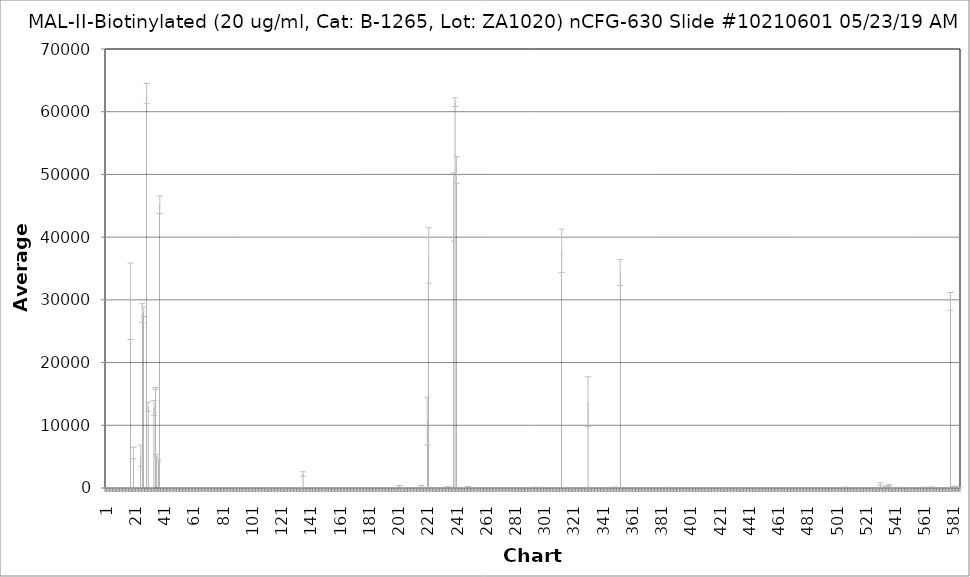
| Category | Average RFU |
|---|---|
| 1.0 | 18.25 |
| 2.0 | 6.75 |
| 3.0 | 15.5 |
| 4.0 | 2.25 |
| 5.0 | 37.75 |
| 6.0 | 1.25 |
| 7.0 | 7.5 |
| 8.0 | 15.75 |
| 9.0 | 2.25 |
| 10.0 | -4 |
| 11.0 | 5.25 |
| 12.0 | 25.75 |
| 13.0 | 25 |
| 14.0 | 26.5 |
| 15.0 | 14.5 |
| 16.0 | 16.5 |
| 17.0 | 6 |
| 18.0 | 29775.25 |
| 19.0 | 26.5 |
| 20.0 | 5591 |
| 21.0 | 12 |
| 22.0 | 43 |
| 23.0 | 11.5 |
| 24.0 | 32.75 |
| 25.0 | 5152.25 |
| 26.0 | 27880.75 |
| 27.0 | 28108.75 |
| 28.0 | 12.75 |
| 29.0 | 62891.5 |
| 30.0 | 12974.25 |
| 31.0 | 50 |
| 32.0 | 26.5 |
| 33.0 | 5 |
| 34.0 | 12738.5 |
| 35.0 | 15885.5 |
| 36.0 | 5072.5 |
| 37.0 | 4325 |
| 38.0 | 45175.25 |
| 39.0 | 9.5 |
| 40.0 | 11.25 |
| 41.0 | 28.75 |
| 42.0 | 17.5 |
| 43.0 | 16.75 |
| 44.0 | 20.75 |
| 45.0 | 33.75 |
| 46.0 | 27.25 |
| 47.0 | -0.75 |
| 48.0 | -1 |
| 49.0 | 14.25 |
| 50.0 | 31.75 |
| 51.0 | 26 |
| 52.0 | 15.5 |
| 53.0 | 2.75 |
| 54.0 | 29.75 |
| 55.0 | 22 |
| 56.0 | 22.25 |
| 57.0 | 34.25 |
| 58.0 | 11.5 |
| 59.0 | 22 |
| 60.0 | 15 |
| 61.0 | 12.75 |
| 62.0 | 22.5 |
| 63.0 | 19.25 |
| 64.0 | 18 |
| 65.0 | 24 |
| 66.0 | 19.75 |
| 67.0 | 17.5 |
| 68.0 | 24.5 |
| 69.0 | 25.5 |
| 70.0 | 29.25 |
| 71.0 | 22.25 |
| 72.0 | 30 |
| 73.0 | 8.25 |
| 74.0 | 20.5 |
| 75.0 | 18.25 |
| 76.0 | 14.25 |
| 77.0 | 23.5 |
| 78.0 | 6 |
| 79.0 | 14.5 |
| 80.0 | -6.5 |
| 81.0 | 22 |
| 82.0 | 27 |
| 83.0 | 42 |
| 84.0 | 4.5 |
| 85.0 | 13.25 |
| 86.0 | 20.75 |
| 87.0 | 43.25 |
| 88.0 | 4.5 |
| 89.0 | 12.25 |
| 90.0 | 18.75 |
| 91.0 | 15.75 |
| 92.0 | 26.25 |
| 93.0 | 47.5 |
| 94.0 | 18 |
| 95.0 | 21.75 |
| 96.0 | 22.75 |
| 97.0 | 24.5 |
| 98.0 | 16.25 |
| 99.0 | 21.75 |
| 100.0 | 2 |
| 101.0 | 3.5 |
| 102.0 | 29 |
| 103.0 | 12.75 |
| 104.0 | 13 |
| 105.0 | 26 |
| 106.0 | 17 |
| 107.0 | 18 |
| 108.0 | 22.5 |
| 109.0 | 37 |
| 110.0 | 22.25 |
| 111.0 | -18.5 |
| 112.0 | 9.5 |
| 113.0 | 22 |
| 114.0 | 12 |
| 115.0 | 14.75 |
| 116.0 | 12.75 |
| 117.0 | 29 |
| 118.0 | 13 |
| 119.0 | 9.5 |
| 120.0 | 14.25 |
| 121.0 | 24 |
| 122.0 | 20.25 |
| 123.0 | 23.25 |
| 124.0 | 13.75 |
| 125.0 | 2.25 |
| 126.0 | 14.75 |
| 127.0 | 19.75 |
| 128.0 | 21.5 |
| 129.0 | 9.75 |
| 130.0 | 16.75 |
| 131.0 | 30.75 |
| 132.0 | 38 |
| 133.0 | 24.5 |
| 134.0 | -14.75 |
| 135.0 | 14.25 |
| 136.0 | 2227 |
| 137.0 | 16.25 |
| 138.0 | 9.25 |
| 139.0 | 3.75 |
| 140.0 | 19.25 |
| 141.0 | 17.5 |
| 142.0 | -6.75 |
| 143.0 | 24.5 |
| 144.0 | 27.25 |
| 145.0 | 17 |
| 146.0 | 3 |
| 147.0 | 3.5 |
| 148.0 | 11.75 |
| 149.0 | 13.25 |
| 150.0 | 9.25 |
| 151.0 | 22.75 |
| 152.0 | 15 |
| 153.0 | 18.75 |
| 154.0 | 25 |
| 155.0 | 15.25 |
| 156.0 | 15.25 |
| 157.0 | 27.5 |
| 158.0 | 20.5 |
| 159.0 | 19 |
| 160.0 | 32.25 |
| 161.0 | 17 |
| 162.0 | 7.5 |
| 163.0 | 30.5 |
| 164.0 | 12.75 |
| 165.0 | 6.5 |
| 166.0 | 21.5 |
| 167.0 | 28.25 |
| 168.0 | 23.75 |
| 169.0 | -3 |
| 170.0 | -1.25 |
| 171.0 | 20 |
| 172.0 | 22.75 |
| 173.0 | 17.25 |
| 174.0 | 28 |
| 175.0 | 14.25 |
| 176.0 | 23.25 |
| 177.0 | 24.25 |
| 178.0 | 13.75 |
| 179.0 | 22.75 |
| 180.0 | 13.5 |
| 181.0 | 12.5 |
| 182.0 | 21.25 |
| 183.0 | 22 |
| 184.0 | 3.25 |
| 185.0 | 10 |
| 186.0 | 10.5 |
| 187.0 | 21.25 |
| 188.0 | -57 |
| 189.0 | 13.25 |
| 190.0 | 13 |
| 191.0 | 21.25 |
| 192.0 | 15.25 |
| 193.0 | 23 |
| 194.0 | 3.25 |
| 195.0 | 1.75 |
| 196.0 | 5.75 |
| 197.0 | 21.75 |
| 198.0 | 11.75 |
| 199.0 | 17.5 |
| 200.0 | 21.5 |
| 201.0 | -24.25 |
| 202.0 | 375.5 |
| 203.0 | 6.75 |
| 204.0 | 28.75 |
| 205.0 | -3.5 |
| 206.0 | 21.75 |
| 207.0 | 16.75 |
| 208.0 | 16.75 |
| 209.0 | 24 |
| 210.0 | 30 |
| 211.0 | 14.75 |
| 212.0 | 19.25 |
| 213.0 | 74.75 |
| 214.0 | 18 |
| 215.0 | -11.25 |
| 216.0 | 33 |
| 217.0 | 377.5 |
| 218.0 | 21.5 |
| 219.0 | 9.5 |
| 220.0 | 21 |
| 221.0 | 10670.75 |
| 222.0 | 37067 |
| 223.0 | 7.5 |
| 224.0 | 30 |
| 225.0 | 18.25 |
| 226.0 | 20.25 |
| 227.0 | 23 |
| 228.0 | 53.5 |
| 229.0 | 25.25 |
| 230.0 | 25.75 |
| 231.0 | 15.25 |
| 232.0 | 7.75 |
| 233.0 | 1.75 |
| 234.0 | 16.75 |
| 235.0 | 172 |
| 236.0 | 18.5 |
| 237.0 | 7.5 |
| 238.0 | 13.75 |
| 239.0 | 44797.75 |
| 240.0 | 61518.75 |
| 241.0 | 50706.5 |
| 242.0 | 12 |
| 243.0 | 26.75 |
| 244.0 | 19.5 |
| 245.0 | 21 |
| 246.0 | 23.25 |
| 247.0 | 12 |
| 248.0 | 25 |
| 249.0 | -107 |
| 250.0 | 13.5 |
| 251.0 | 7 |
| 252.0 | 13.25 |
| 253.0 | 27.25 |
| 254.0 | 16 |
| 255.0 | 22 |
| 256.0 | 9.5 |
| 257.0 | 6.75 |
| 258.0 | 16.5 |
| 259.0 | 24.25 |
| 260.0 | 21 |
| 261.0 | 16.75 |
| 262.0 | -2 |
| 263.0 | 3.25 |
| 264.0 | 21.5 |
| 265.0 | 18.5 |
| 266.0 | 19.25 |
| 267.0 | 9.75 |
| 268.0 | 5.5 |
| 269.0 | 21.75 |
| 270.0 | 18 |
| 271.0 | 21.5 |
| 272.0 | -17.5 |
| 273.0 | 13.75 |
| 274.0 | 6.25 |
| 275.0 | 15.5 |
| 276.0 | 15.25 |
| 277.0 | 10.75 |
| 278.0 | 28.5 |
| 279.0 | 22.5 |
| 280.0 | 9.25 |
| 281.0 | 15.5 |
| 282.0 | 10.75 |
| 283.0 | 25.75 |
| 284.0 | -13 |
| 285.0 | 20.75 |
| 286.0 | 15.25 |
| 287.0 | 22 |
| 288.0 | 26.5 |
| 289.0 | 33 |
| 290.0 | 22 |
| 291.0 | 19 |
| 292.0 | 23.75 |
| 293.0 | 26 |
| 294.0 | 33.25 |
| 295.0 | 101.25 |
| 296.0 | 29.75 |
| 297.0 | 20.5 |
| 298.0 | 21.5 |
| 299.0 | 19.5 |
| 300.0 | 23 |
| 301.0 | 14.5 |
| 302.0 | 24.75 |
| 303.0 | 10 |
| 304.0 | 25.25 |
| 305.0 | 22.25 |
| 306.0 | 16.75 |
| 307.0 | -12.25 |
| 308.0 | 23.25 |
| 309.0 | 16 |
| 310.0 | 23 |
| 311.0 | 20.5 |
| 312.0 | 18.75 |
| 313.0 | 37825.25 |
| 314.0 | 24.25 |
| 315.0 | 25.25 |
| 316.0 | 1 |
| 317.0 | 18.25 |
| 318.0 | 18.75 |
| 319.0 | 38 |
| 320.0 | 12 |
| 321.0 | 12.5 |
| 322.0 | 29 |
| 323.0 | 22.5 |
| 324.0 | 5.25 |
| 325.0 | 10.75 |
| 326.0 | 11.5 |
| 327.0 | 16.75 |
| 328.0 | 25.5 |
| 329.0 | 8 |
| 330.0 | 22.25 |
| 331.0 | 13753.5 |
| 332.0 | -7.75 |
| 333.0 | 46.25 |
| 334.0 | 21.5 |
| 335.0 | 23 |
| 336.0 | 52.75 |
| 337.0 | -7 |
| 338.0 | 22.75 |
| 339.0 | 15.75 |
| 340.0 | 22.25 |
| 341.0 | 10 |
| 342.0 | 5.5 |
| 343.0 | 29.25 |
| 344.0 | 31.25 |
| 345.0 | 23.5 |
| 346.0 | 38.5 |
| 347.0 | -4.25 |
| 348.0 | 31.75 |
| 349.0 | 109.5 |
| 350.0 | 23 |
| 351.0 | 8.5 |
| 352.0 | 19.25 |
| 353.0 | 34361 |
| 354.0 | 28.25 |
| 355.0 | 63.5 |
| 356.0 | 66 |
| 357.0 | 45.25 |
| 358.0 | 19.25 |
| 359.0 | 78 |
| 360.0 | -47 |
| 361.0 | 15.75 |
| 362.0 | 8.25 |
| 363.0 | 27 |
| 364.0 | 22.75 |
| 365.0 | 25.25 |
| 366.0 | 43 |
| 367.0 | 37 |
| 368.0 | 35.75 |
| 369.0 | 44.75 |
| 370.0 | 17.75 |
| 371.0 | 22 |
| 372.0 | 53.5 |
| 373.0 | 45.75 |
| 374.0 | 0 |
| 375.0 | 21.75 |
| 376.0 | 21.5 |
| 377.0 | 26.5 |
| 378.0 | 37.5 |
| 379.0 | 24.5 |
| 380.0 | 28 |
| 381.0 | 27.25 |
| 382.0 | 23 |
| 383.0 | 26.5 |
| 384.0 | 23.5 |
| 385.0 | 31.5 |
| 386.0 | 74 |
| 387.0 | 24.5 |
| 388.0 | 41 |
| 389.0 | 38.25 |
| 390.0 | 22 |
| 391.0 | 24.75 |
| 392.0 | 20.25 |
| 393.0 | 30.25 |
| 394.0 | 24.25 |
| 395.0 | 17.25 |
| 396.0 | 33.25 |
| 397.0 | 22.75 |
| 398.0 | 24 |
| 399.0 | 24 |
| 400.0 | 25 |
| 401.0 | 27.5 |
| 402.0 | 30 |
| 403.0 | 26.75 |
| 404.0 | 31.25 |
| 405.0 | 26.25 |
| 406.0 | 26.25 |
| 407.0 | 26.75 |
| 408.0 | 9.25 |
| 409.0 | 56.75 |
| 410.0 | 32.25 |
| 411.0 | 36.75 |
| 412.0 | 18.5 |
| 413.0 | 16 |
| 414.0 | -4.25 |
| 415.0 | 5.25 |
| 416.0 | 3.5 |
| 417.0 | 25.5 |
| 418.0 | 15.25 |
| 419.0 | 27.5 |
| 420.0 | 41.5 |
| 421.0 | 27.75 |
| 422.0 | 18.75 |
| 423.0 | 29 |
| 424.0 | 13.5 |
| 425.0 | 19 |
| 426.0 | 16.75 |
| 427.0 | 6.25 |
| 428.0 | 24.25 |
| 429.0 | 22.25 |
| 430.0 | 26.75 |
| 431.0 | 20.5 |
| 432.0 | 24.25 |
| 433.0 | 17 |
| 434.0 | 0.75 |
| 435.0 | -2 |
| 436.0 | 3.5 |
| 437.0 | -12.25 |
| 438.0 | -4.75 |
| 439.0 | 39.75 |
| 440.0 | 33.75 |
| 441.0 | 20.75 |
| 442.0 | 21.75 |
| 443.0 | 23.25 |
| 444.0 | 24.5 |
| 445.0 | 3 |
| 446.0 | 27 |
| 447.0 | 26.5 |
| 448.0 | 51.5 |
| 449.0 | 7.25 |
| 450.0 | 65.75 |
| 451.0 | 24.5 |
| 452.0 | -1.25 |
| 453.0 | -3 |
| 454.0 | 4.75 |
| 455.0 | -4 |
| 456.0 | 17 |
| 457.0 | 15.5 |
| 458.0 | 11.75 |
| 459.0 | 8.75 |
| 460.0 | 1.25 |
| 461.0 | 0.75 |
| 462.0 | 25.5 |
| 463.0 | -6 |
| 464.0 | 23.25 |
| 465.0 | 55.25 |
| 466.0 | 27.25 |
| 467.0 | 38.75 |
| 468.0 | 38.5 |
| 469.0 | 18 |
| 470.0 | 27.75 |
| 471.0 | 16.75 |
| 472.0 | 26.5 |
| 473.0 | 31.75 |
| 474.0 | 30.25 |
| 475.0 | -12 |
| 476.0 | 20.5 |
| 477.0 | 48.75 |
| 478.0 | 19.25 |
| 479.0 | 17 |
| 480.0 | 17.5 |
| 481.0 | 27.5 |
| 482.0 | 30 |
| 483.0 | -0.5 |
| 484.0 | 23.5 |
| 485.0 | 5.5 |
| 486.0 | 27 |
| 487.0 | 47.25 |
| 488.0 | 18.25 |
| 489.0 | 10.25 |
| 490.0 | -8 |
| 491.0 | 17.25 |
| 492.0 | 25.25 |
| 493.0 | 27.5 |
| 494.0 | 11.5 |
| 495.0 | 21.5 |
| 496.0 | 26.25 |
| 497.0 | 24 |
| 498.0 | -4.75 |
| 499.0 | 10 |
| 500.0 | 25.5 |
| 501.0 | 7.25 |
| 502.0 | 14.5 |
| 503.0 | -2 |
| 504.0 | 15.5 |
| 505.0 | -2.75 |
| 506.0 | 0.75 |
| 507.0 | 104.5 |
| 508.0 | 9.5 |
| 509.0 | 2 |
| 510.0 | -12.5 |
| 511.0 | 6.25 |
| 512.0 | 21.25 |
| 513.0 | 21.5 |
| 514.0 | 14.25 |
| 515.0 | 16.75 |
| 516.0 | 8.5 |
| 517.0 | 17.5 |
| 518.0 | 15.5 |
| 519.0 | -0.25 |
| 520.0 | 12.5 |
| 521.0 | 3.5 |
| 522.0 | 16.5 |
| 523.0 | 24.25 |
| 524.0 | 23.5 |
| 525.0 | 24.75 |
| 526.0 | 19.5 |
| 527.0 | 17 |
| 528.0 | 8.5 |
| 529.0 | 17.75 |
| 530.0 | 30 |
| 531.0 | 648 |
| 532.0 | 6.25 |
| 533.0 | 13.5 |
| 534.0 | 38.25 |
| 535.0 | 276.75 |
| 536.0 | 35 |
| 537.0 | 414.75 |
| 538.0 | 61.75 |
| 539.0 | 7.75 |
| 540.0 | 19 |
| 541.0 | 19.75 |
| 542.0 | 19 |
| 543.0 | 7.5 |
| 544.0 | 17 |
| 545.0 | 63 |
| 546.0 | 72.75 |
| 547.0 | 68.25 |
| 548.0 | 15 |
| 549.0 | 11.75 |
| 550.0 | 9.25 |
| 551.0 | 38.75 |
| 552.0 | 28.75 |
| 553.0 | 13.5 |
| 554.0 | 29.25 |
| 555.0 | 17.25 |
| 556.0 | 8.25 |
| 557.0 | 51.5 |
| 558.0 | 77.5 |
| 559.0 | 5.25 |
| 560.0 | 33.75 |
| 561.0 | 33.75 |
| 562.0 | 91.5 |
| 563.0 | 60.5 |
| 564.0 | 50.5 |
| 565.0 | 67.25 |
| 566.0 | 119 |
| 567.0 | -4.75 |
| 568.0 | -1.5 |
| 569.0 | 14.5 |
| 570.0 | 5 |
| 571.0 | 17.75 |
| 572.0 | -2.75 |
| 573.0 | -11.5 |
| 574.0 | 12.75 |
| 575.0 | 6.75 |
| 576.0 | 30.75 |
| 577.0 | 4.25 |
| 578.0 | 31.75 |
| 579.0 | 29765.75 |
| 580.0 | 22.25 |
| 581.0 | 176 |
| 582.0 | 265.25 |
| 583.0 | 52 |
| 584.0 | 5.25 |
| 585.0 | 71 |